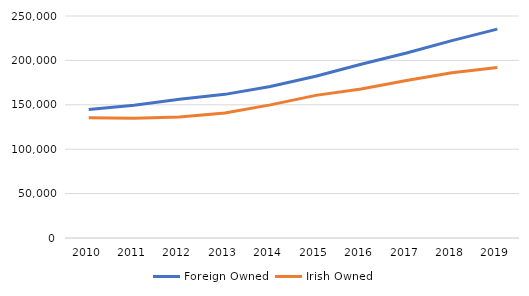
| Category | Foreign Owned | Irish Owned |
|---|---|---|
| 2010.0 | 144815 | 135396 |
| 2011.0 | 149518 | 134722 |
| 2012.0 | 156362 | 136297 |
| 2013.0 | 161756 | 140844 |
| 2014.0 | 170520 | 149913 |
| 2015.0 | 182099 | 160598 |
| 2016.0 | 195614 | 167776 |
| 2017.0 | 208284 | 177306 |
| 2018.0 | 222310 | 186208 |
| 2019.0 | 235245 | 191906 |